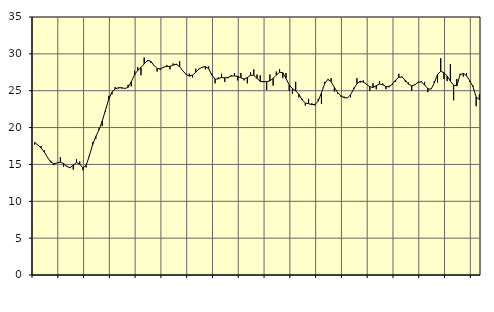
| Category | Piggar | Series 1 |
|---|---|---|
| nan | 17.7 | 17.99 |
| 87.0 | 17.6 | 17.63 |
| 87.0 | 17.5 | 17.23 |
| 87.0 | 16.9 | 16.69 |
| nan | 15.9 | 15.96 |
| 88.0 | 15.5 | 15.31 |
| 88.0 | 14.9 | 15.1 |
| 88.0 | 15.2 | 15.21 |
| nan | 16 | 15.3 |
| 89.0 | 14.7 | 15.12 |
| 89.0 | 14.8 | 14.72 |
| 89.0 | 14.5 | 14.57 |
| nan | 14.3 | 14.9 |
| 90.0 | 15.7 | 15.26 |
| 90.0 | 15.4 | 15.03 |
| 90.0 | 14.2 | 14.53 |
| nan | 14.6 | 14.87 |
| 91.0 | 16.1 | 16.2 |
| 91.0 | 18 | 17.69 |
| 91.0 | 18.5 | 18.8 |
| nan | 19.9 | 19.7 |
| 92.0 | 20.2 | 20.9 |
| 92.0 | 22.1 | 22.39 |
| 92.0 | 24.3 | 23.83 |
| nan | 24.5 | 24.81 |
| 93.0 | 25.5 | 25.24 |
| 93.0 | 25.3 | 25.41 |
| 93.0 | 25.3 | 25.41 |
| nan | 25.3 | 25.3 |
| 94.0 | 25.8 | 25.45 |
| 94.0 | 25.6 | 26.22 |
| 94.0 | 27.7 | 27.16 |
| nan | 28.2 | 27.76 |
| 95.0 | 27.1 | 28.14 |
| 95.0 | 29.5 | 28.64 |
| 95.0 | 29 | 29.11 |
| nan | 28.8 | 29.02 |
| 96.0 | 28.5 | 28.46 |
| 96.0 | 27.6 | 28.02 |
| 96.0 | 27.8 | 27.97 |
| nan | 28.1 | 28.18 |
| 97.0 | 28.5 | 28.3 |
| 97.0 | 27.9 | 28.3 |
| 97.0 | 28.7 | 28.48 |
| nan | 28.5 | 28.6 |
| 98.0 | 29 | 28.27 |
| 98.0 | 27.7 | 27.69 |
| 98.0 | 27.3 | 27.21 |
| nan | 27.3 | 26.98 |
| 99.0 | 26.8 | 27.12 |
| 99.0 | 28 | 27.5 |
| 99.0 | 28 | 27.94 |
| nan | 28.1 | 28.19 |
| 0.0 | 27.9 | 28.28 |
| 0.0 | 28.3 | 27.98 |
| 0.0 | 27.3 | 27.12 |
| nan | 26 | 26.56 |
| 1.0 | 26.8 | 26.62 |
| 1.0 | 27.3 | 26.79 |
| 1.0 | 26.2 | 26.74 |
| nan | 26.7 | 26.8 |
| 2.0 | 27.1 | 26.99 |
| 2.0 | 27.4 | 27.01 |
| 2.0 | 26.4 | 26.94 |
| nan | 27.4 | 26.76 |
| 3.0 | 26.4 | 26.59 |
| 3.0 | 26 | 26.79 |
| 3.0 | 27.5 | 27.1 |
| nan | 27.9 | 27.09 |
| 4.0 | 27.2 | 26.68 |
| 4.0 | 27.1 | 26.27 |
| 4.0 | 26.3 | 26.21 |
| nan | 25.1 | 26.24 |
| 5.0 | 27.2 | 26.33 |
| 5.0 | 25.7 | 26.68 |
| 5.0 | 27.6 | 27.11 |
| nan | 27.9 | 27.5 |
| 6.0 | 26.7 | 27.45 |
| 6.0 | 27.4 | 26.67 |
| 6.0 | 25 | 25.79 |
| nan | 24.6 | 25.28 |
| 7.0 | 26.2 | 24.99 |
| 7.0 | 24.1 | 24.5 |
| 7.0 | 23.9 | 23.75 |
| nan | 23 | 23.33 |
| 8.0 | 23.9 | 23.24 |
| 8.0 | 23.3 | 23.11 |
| 8.0 | 23 | 23.13 |
| nan | 23.9 | 23.59 |
| 9.0 | 23.2 | 24.72 |
| 9.0 | 26.2 | 25.97 |
| 9.0 | 26.6 | 26.53 |
| nan | 26.7 | 26.23 |
| 10.0 | 24.9 | 25.46 |
| 10.0 | 24.6 | 24.77 |
| 10.0 | 24.2 | 24.32 |
| nan | 24.2 | 24.05 |
| 11.0 | 24 | 24.03 |
| 11.0 | 24.1 | 24.44 |
| 11.0 | 25.4 | 25.22 |
| nan | 26.7 | 25.95 |
| 12.0 | 26.1 | 26.28 |
| 12.0 | 26.4 | 26.16 |
| 12.0 | 25.8 | 25.86 |
| nan | 25 | 25.55 |
| 13.0 | 26 | 25.44 |
| 13.0 | 25.2 | 25.69 |
| 13.0 | 26.3 | 25.91 |
| nan | 26 | 25.81 |
| 14.0 | 25.2 | 25.56 |
| 14.0 | 25.7 | 25.52 |
| 14.0 | 25.8 | 25.91 |
| nan | 26.2 | 26.45 |
| 15.0 | 27.3 | 26.82 |
| 15.0 | 26.9 | 26.85 |
| 15.0 | 26.2 | 26.44 |
| nan | 26.1 | 25.89 |
| 16.0 | 25 | 25.66 |
| 16.0 | 25.9 | 25.8 |
| 16.0 | 26.2 | 26.15 |
| nan | 26.3 | 26.19 |
| 17.0 | 26.2 | 25.78 |
| 17.0 | 24.8 | 25.28 |
| 17.0 | 25.2 | 25.2 |
| nan | 26.3 | 26.05 |
| 18.0 | 26.1 | 27.19 |
| 18.0 | 29.4 | 27.62 |
| 18.0 | 26.6 | 27.46 |
| nan | 26.3 | 26.99 |
| 19.0 | 28.6 | 26.3 |
| 19.0 | 23.7 | 25.76 |
| 19.0 | 26.6 | 25.67 |
| nan | 27.3 | 27.15 |
| 20.0 | 26.9 | 27.36 |
| 20.0 | 27.4 | 27.04 |
| 20.0 | 26.2 | 26.36 |
| nan | 25.7 | 25.56 |
| 21.0 | 22.9 | 24.15 |
| 21.0 | 24.5 | 23.8 |